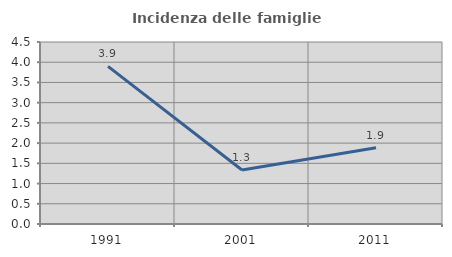
| Category | Incidenza delle famiglie numerose |
|---|---|
| 1991.0 | 3.897 |
| 2001.0 | 1.336 |
| 2011.0 | 1.886 |